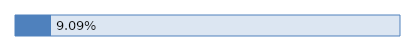
| Category | Series 0 |
|---|---|
| 0 | 0.091 |